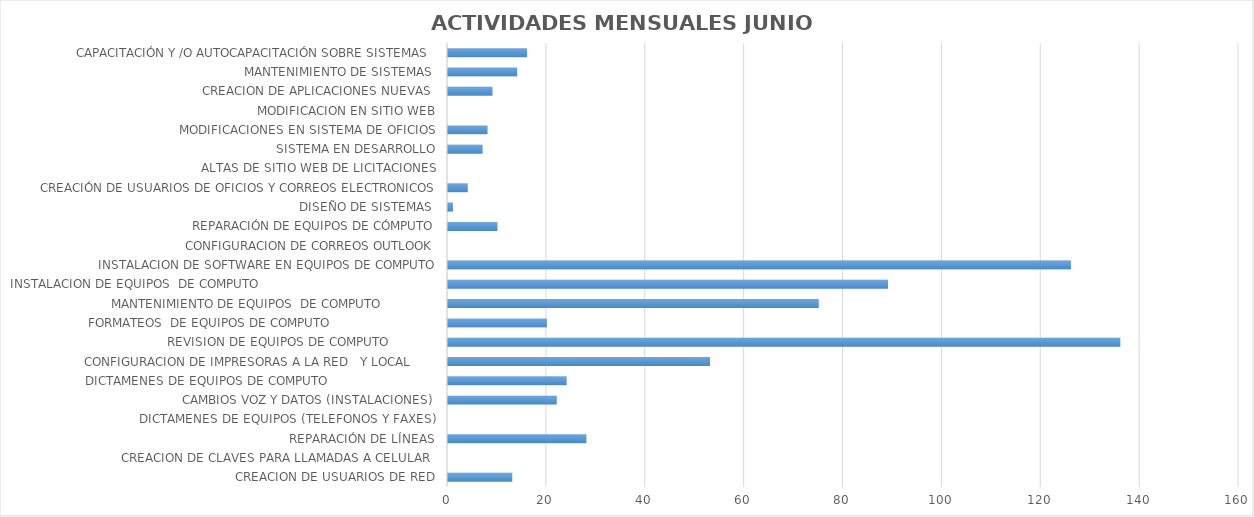
| Category | Series 0 |
|---|---|
| CREACION DE USUARIOS DE RED | 13 |
| CREACION DE CLAVES PARA LLAMADAS A CELULAR  | 0 |
| REPARACIÓN DE LÍNEAS | 28 |
| DICTAMENES DE EQUIPOS (TELEFONOS Y FAXES) | 0 |
| CAMBIOS VOZ Y DATOS (INSTALACIONES) | 22 |
| DICTAMENES DE EQUIPOS DE COMPUTO                             | 24 |
| CONFIGURACION DE IMPRESORAS A LA RED   Y LOCAL       | 53 |
| REVISION DE EQUIPOS DE COMPUTO             | 136 |
| FORMATEOS  DE EQUIPOS DE COMPUTO                            | 20 |
| MANTENIMIENTO DE EQUIPOS  DE COMPUTO               | 75 |
| INSTALACION DE EQUIPOS  DE COMPUTO                                               | 89 |
| INSTALACION DE SOFTWARE EN EQUIPOS DE COMPUTO | 126 |
| CONFIGURACION DE CORREOS OUTLOOK | 0 |
| REPARACIÓN DE EQUIPOS DE CÓMPUTO | 10 |
| DISEÑO DE SISTEMAS  | 1 |
| CREACIÓN DE USUARIOS DE OFICIOS Y CORREOS ELECTRONICOS | 4 |
| ALTAS DE SITIO WEB DE LICITACIONES | 0 |
| SISTEMA EN DESARROLLO | 7 |
| MODIFICACIONES EN SISTEMA DE OFICIOS | 8 |
| MODIFICACION EN SITIO WEB | 0 |
| CREACION DE APLICACIONES NUEVAS  | 9 |
| MANTENIMIENTO DE SISTEMAS  | 14 |
| CAPACITACIÓN Y /O AUTOCAPACITACIÓN SOBRE SISTEMAS  | 16 |